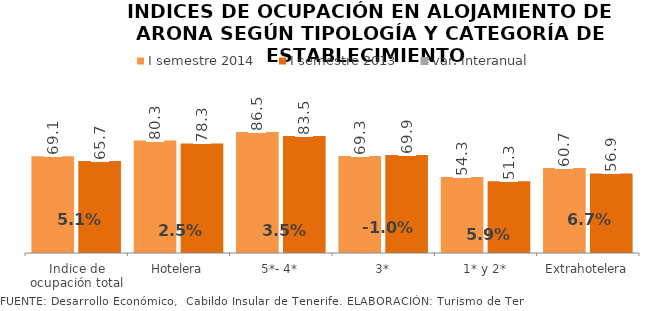
| Category | I semestre 2014 | I semestre 2013 |
|---|---|---|
| Indice de ocupación total | 69.095 | 65.733 |
| Hotelera | 80.286 | 78.3 |
| 5*- 4* | 86.503 | 83.54 |
| 3* | 69.253 | 69.943 |
| 1* y 2* | 54.333 | 51.326 |
| Extrahotelera | 60.682 | 56.87 |